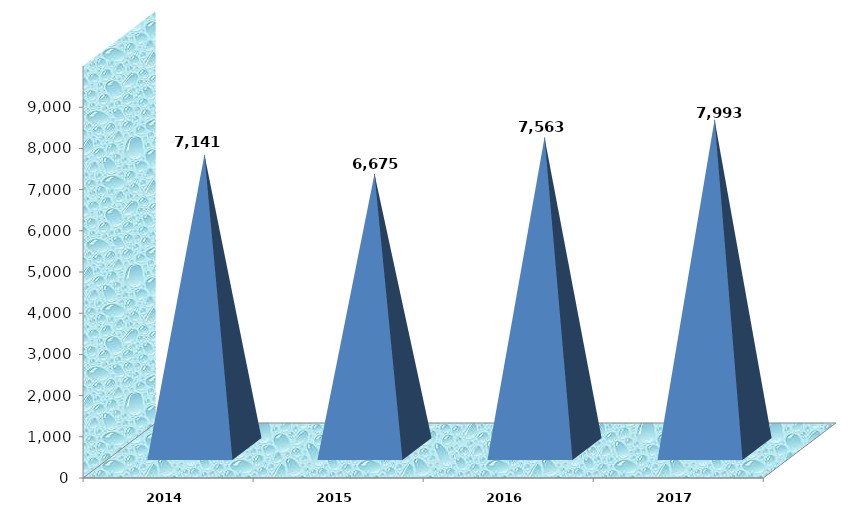
| Category | Series 0 |
|---|---|
| 2014 | 7140850 |
| 2015 | 6675362 |
| 2016 | 7563283.233 |
| 2017 | 7992665.88 |